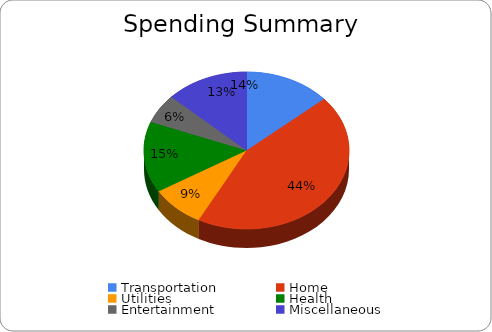
| Category | Series 0 |
|---|---|
| Transportation | 673.167 |
| Home | 2175 |
| Utilities | 425 |
| Health | 720.833 |
| Entertainment | 295 |
| Miscellaneous | 646.667 |